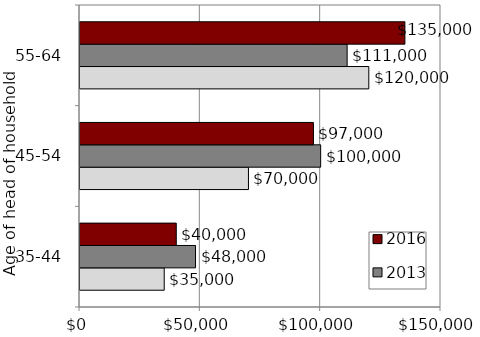
| Category | 2010 | 2013 | 2016 |
|---|---|---|---|
| 35-44 | 35000 | 48000 | 40000 |
| 45-54 | 70000 | 100000 | 97000 |
| 55-64 | 120000 | 111000 | 135000 |